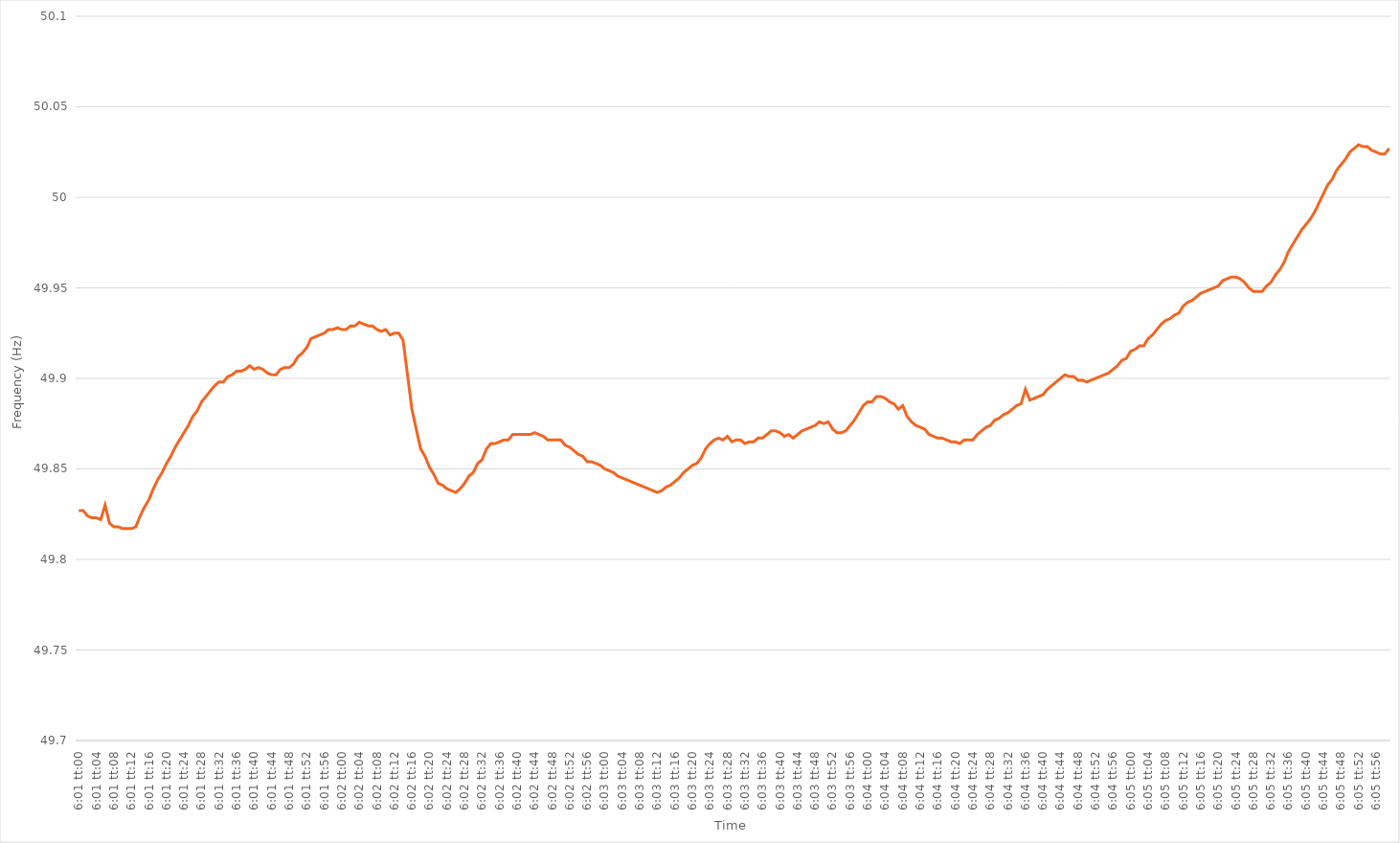
| Category | Series 0 |
|---|---|
| 0.25069444444444444 | 49.827 |
| 0.25070601851851854 | 49.827 |
| 0.2507175925925926 | 49.824 |
| 0.25072916666666667 | 49.823 |
| 0.25074074074074076 | 49.823 |
| 0.2507523148148148 | 49.822 |
| 0.2507638888888889 | 49.83 |
| 0.250775462962963 | 49.82 |
| 0.25078703703703703 | 49.818 |
| 0.2507986111111111 | 49.818 |
| 0.2508101851851852 | 49.817 |
| 0.25082175925925926 | 49.817 |
| 0.2508333333333333 | 49.817 |
| 0.2508449074074074 | 49.818 |
| 0.2508564814814815 | 49.824 |
| 0.2508680555555555 | 49.829 |
| 0.2508796296296296 | 49.833 |
| 0.2508912037037037 | 49.839 |
| 0.25090277777777775 | 49.844 |
| 0.25091435185185185 | 49.848 |
| 0.25092592592592594 | 49.853 |
| 0.2509375 | 49.857 |
| 0.2509490740740741 | 49.862 |
| 0.25096064814814817 | 49.866 |
| 0.2509722222222222 | 49.87 |
| 0.2509837962962963 | 49.874 |
| 0.2509953703703704 | 49.879 |
| 0.25100694444444444 | 49.882 |
| 0.25101851851851853 | 49.887 |
| 0.2510300925925926 | 49.89 |
| 0.25104166666666666 | 49.893 |
| 0.25105324074074076 | 49.896 |
| 0.25106481481481485 | 49.898 |
| 0.2510763888888889 | 49.898 |
| 0.25108796296296293 | 49.901 |
| 0.251099537037037 | 49.902 |
| 0.2511111111111111 | 49.904 |
| 0.25112268518518516 | 49.904 |
| 0.25113425925925925 | 49.905 |
| 0.25114583333333335 | 49.907 |
| 0.2511574074074074 | 49.905 |
| 0.2511689814814815 | 49.906 |
| 0.2511805555555556 | 49.905 |
| 0.2511921296296296 | 49.903 |
| 0.2512037037037037 | 49.902 |
| 0.2512152777777778 | 49.902 |
| 0.25122685185185184 | 49.905 |
| 0.25123842592592593 | 49.906 |
| 0.25125000000000003 | 49.906 |
| 0.25126157407407407 | 49.908 |
| 0.25127314814814816 | 49.912 |
| 0.25128472222222226 | 49.914 |
| 0.2512962962962963 | 49.917 |
| 0.25130787037037033 | 49.922 |
| 0.25131944444444443 | 49.923 |
| 0.2513310185185185 | 49.924 |
| 0.25134259259259256 | 49.925 |
| 0.25135416666666666 | 49.927 |
| 0.25136574074074075 | 49.927 |
| 0.2513773148148148 | 49.928 |
| 0.2513888888888889 | 49.927 |
| 0.251400462962963 | 49.927 |
| 0.251412037037037 | 49.929 |
| 0.2514236111111111 | 49.929 |
| 0.2514351851851852 | 49.931 |
| 0.25144675925925924 | 49.93 |
| 0.25145833333333334 | 49.929 |
| 0.25146990740740743 | 49.929 |
| 0.2514814814814815 | 49.927 |
| 0.25149305555555557 | 49.926 |
| 0.25150462962962966 | 49.927 |
| 0.2515162037037037 | 49.924 |
| 0.2515277777777778 | 49.925 |
| 0.25153935185185183 | 49.925 |
| 0.25155092592592593 | 49.921 |
| 0.25156249999999997 | 49.902 |
| 0.25157407407407406 | 49.883 |
| 0.25158564814814816 | 49.872 |
| 0.2515972222222222 | 49.861 |
| 0.2516087962962963 | 49.857 |
| 0.2516203703703704 | 49.851 |
| 0.2516319444444444 | 49.847 |
| 0.2516435185185185 | 49.842 |
| 0.2516550925925926 | 49.841 |
| 0.25166666666666665 | 49.839 |
| 0.25167824074074074 | 49.838 |
| 0.25168981481481484 | 49.837 |
| 0.2517013888888889 | 49.839 |
| 0.25171296296296297 | 49.842 |
| 0.25172453703703707 | 49.846 |
| 0.2517361111111111 | 49.848 |
| 0.2517476851851852 | 49.853 |
| 0.2517592592592593 | 49.855 |
| 0.25177083333333333 | 49.861 |
| 0.25178240740740737 | 49.864 |
| 0.25179398148148147 | 49.864 |
| 0.25180555555555556 | 49.865 |
| 0.2518171296296296 | 49.866 |
| 0.2518287037037037 | 49.866 |
| 0.2518402777777778 | 49.869 |
| 0.2518518518518518 | 49.869 |
| 0.2518634259259259 | 49.869 |
| 0.251875 | 49.869 |
| 0.25188657407407405 | 49.869 |
| 0.25189814814814815 | 49.87 |
| 0.25190972222222224 | 49.869 |
| 0.2519212962962963 | 49.868 |
| 0.2519328703703704 | 49.866 |
| 0.25194444444444447 | 49.866 |
| 0.2519560185185185 | 49.866 |
| 0.2519675925925926 | 49.866 |
| 0.2519791666666667 | 49.863 |
| 0.25199074074074074 | 49.862 |
| 0.25200231481481483 | 49.86 |
| 0.25201388888888887 | 49.858 |
| 0.25202546296296297 | 49.857 |
| 0.252037037037037 | 49.854 |
| 0.2520486111111111 | 49.854 |
| 0.2520601851851852 | 49.853 |
| 0.25207175925925923 | 49.852 |
| 0.2520833333333333 | 49.85 |
| 0.2520949074074074 | 49.849 |
| 0.25210648148148146 | 49.848 |
| 0.25211805555555555 | 49.846 |
| 0.25212962962962965 | 49.845 |
| 0.2521412037037037 | 49.844 |
| 0.2521527777777778 | 49.843 |
| 0.2521643518518519 | 49.842 |
| 0.2521759259259259 | 49.841 |
| 0.2521875 | 49.84 |
| 0.2521990740740741 | 49.839 |
| 0.25221064814814814 | 49.838 |
| 0.25222222222222224 | 49.837 |
| 0.25223379629629633 | 49.838 |
| 0.25224537037037037 | 49.84 |
| 0.2522569444444444 | 49.841 |
| 0.2522685185185185 | 49.843 |
| 0.2522800925925926 | 49.845 |
| 0.25229166666666664 | 49.848 |
| 0.25230324074074073 | 49.85 |
| 0.2523148148148148 | 49.852 |
| 0.25232638888888886 | 49.853 |
| 0.25233796296296296 | 49.856 |
| 0.25234953703703705 | 49.861 |
| 0.2523611111111111 | 49.864 |
| 0.2523726851851852 | 49.866 |
| 0.2523842592592593 | 49.867 |
| 0.2523958333333333 | 49.866 |
| 0.2524074074074074 | 49.868 |
| 0.2524189814814815 | 49.865 |
| 0.25243055555555555 | 49.866 |
| 0.25244212962962964 | 49.866 |
| 0.25245370370370374 | 49.864 |
| 0.2524652777777778 | 49.865 |
| 0.25247685185185187 | 49.865 |
| 0.2524884259259259 | 49.867 |
| 0.2525 | 49.867 |
| 0.25251157407407404 | 49.869 |
| 0.25252314814814814 | 49.871 |
| 0.25253472222222223 | 49.871 |
| 0.25254629629629627 | 49.87 |
| 0.25255787037037036 | 49.868 |
| 0.25256944444444446 | 49.869 |
| 0.2525810185185185 | 49.867 |
| 0.2525925925925926 | 49.869 |
| 0.2526041666666667 | 49.871 |
| 0.2526157407407407 | 49.872 |
| 0.2526273148148148 | 49.873 |
| 0.2526388888888889 | 49.874 |
| 0.25265046296296295 | 49.876 |
| 0.25266203703703705 | 49.875 |
| 0.25267361111111114 | 49.876 |
| 0.2526851851851852 | 49.872 |
| 0.2526967592592593 | 49.87 |
| 0.25270833333333337 | 49.87 |
| 0.2527199074074074 | 49.871 |
| 0.25273148148148145 | 49.874 |
| 0.25274305555555554 | 49.877 |
| 0.25275462962962963 | 49.881 |
| 0.2527662037037037 | 49.885 |
| 0.25277777777777777 | 49.887 |
| 0.25278935185185186 | 49.887 |
| 0.2528009259259259 | 49.89 |
| 0.2528125 | 49.89 |
| 0.2528240740740741 | 49.889 |
| 0.25283564814814813 | 49.887 |
| 0.2528472222222222 | 49.886 |
| 0.2528587962962963 | 49.883 |
| 0.25287037037037036 | 49.885 |
| 0.25288194444444445 | 49.879 |
| 0.25289351851851855 | 49.876 |
| 0.2529050925925926 | 49.874 |
| 0.2529166666666667 | 49.873 |
| 0.2529282407407408 | 49.872 |
| 0.2529398148148148 | 49.869 |
| 0.2529513888888889 | 49.868 |
| 0.25296296296296295 | 49.867 |
| 0.25297453703703704 | 49.867 |
| 0.2529861111111111 | 49.866 |
| 0.2529976851851852 | 49.865 |
| 0.25300925925925927 | 49.865 |
| 0.2530208333333333 | 49.864 |
| 0.2530324074074074 | 49.866 |
| 0.2530439814814815 | 49.866 |
| 0.25305555555555553 | 49.866 |
| 0.25306712962962963 | 49.869 |
| 0.2530787037037037 | 49.871 |
| 0.25309027777777776 | 49.873 |
| 0.25310185185185186 | 49.874 |
| 0.25311342592592595 | 49.877 |
| 0.253125 | 49.878 |
| 0.2531365740740741 | 49.88 |
| 0.2531481481481482 | 49.881 |
| 0.2531597222222222 | 49.883 |
| 0.2531712962962963 | 49.885 |
| 0.2531828703703704 | 49.886 |
| 0.25319444444444444 | 49.894 |
| 0.2532060185185185 | 49.888 |
| 0.2532175925925926 | 49.889 |
| 0.25322916666666667 | 49.89 |
| 0.2532407407407407 | 49.891 |
| 0.2532523148148148 | 49.894 |
| 0.2532638888888889 | 49.896 |
| 0.25327546296296294 | 49.898 |
| 0.25328703703703703 | 49.9 |
| 0.2532986111111111 | 49.902 |
| 0.25331018518518517 | 49.901 |
| 0.25332175925925926 | 49.901 |
| 0.25333333333333335 | 49.899 |
| 0.2533449074074074 | 49.899 |
| 0.2533564814814815 | 49.898 |
| 0.2533680555555556 | 49.899 |
| 0.2533796296296296 | 49.9 |
| 0.2533912037037037 | 49.901 |
| 0.2534027777777778 | 49.902 |
| 0.25341435185185185 | 49.903 |
| 0.25342592592592594 | 49.905 |
| 0.2534375 | 49.907 |
| 0.2534490740740741 | 49.91 |
| 0.2534606481481481 | 49.911 |
| 0.2534722222222222 | 49.915 |
| 0.2534837962962963 | 49.916 |
| 0.25349537037037034 | 49.918 |
| 0.25350694444444444 | 49.918 |
| 0.25351851851851853 | 49.922 |
| 0.25353009259259257 | 49.924 |
| 0.25354166666666667 | 49.927 |
| 0.25355324074074076 | 49.93 |
| 0.2535648148148148 | 49.932 |
| 0.2535763888888889 | 49.933 |
| 0.253587962962963 | 49.935 |
| 0.253599537037037 | 49.936 |
| 0.2536111111111111 | 49.94 |
| 0.2536226851851852 | 49.942 |
| 0.25363425925925925 | 49.943 |
| 0.25364583333333335 | 49.945 |
| 0.25365740740740744 | 49.947 |
| 0.2536689814814815 | 49.948 |
| 0.2536805555555555 | 49.949 |
| 0.2536921296296296 | 49.95 |
| 0.2537037037037037 | 49.951 |
| 0.25371527777777775 | 49.954 |
| 0.25372685185185184 | 49.955 |
| 0.25373842592592594 | 49.956 |
| 0.25375 | 49.956 |
| 0.25376157407407407 | 49.955 |
| 0.25377314814814816 | 49.953 |
| 0.2537847222222222 | 49.95 |
| 0.2537962962962963 | 49.948 |
| 0.2538078703703704 | 49.948 |
| 0.25381944444444443 | 49.948 |
| 0.2538310185185185 | 49.951 |
| 0.2538425925925926 | 49.953 |
| 0.25385416666666666 | 49.957 |
| 0.25386574074074075 | 49.96 |
| 0.25387731481481485 | 49.964 |
| 0.2538888888888889 | 49.97 |
| 0.253900462962963 | 49.974 |
| 0.253912037037037 | 49.978 |
| 0.2539236111111111 | 49.982 |
| 0.25393518518518515 | 49.985 |
| 0.25394675925925925 | 49.988 |
| 0.25395833333333334 | 49.992 |
| 0.2539699074074074 | 49.997 |
| 0.2539814814814815 | 50.002 |
| 0.25399305555555557 | 50.007 |
| 0.2540046296296296 | 50.01 |
| 0.2540162037037037 | 50.015 |
| 0.2540277777777778 | 50.018 |
| 0.25403935185185184 | 50.021 |
| 0.25405092592592593 | 50.025 |
| 0.2540625 | 50.027 |
| 0.25407407407407406 | 50.029 |
| 0.25408564814814816 | 50.028 |
| 0.25409722222222225 | 50.028 |
| 0.2541087962962963 | 50.026 |
| 0.2541203703703704 | 50.025 |
| 0.2541319444444445 | 50.024 |
| 0.2541435185185185 | 50.024 |
| 0.25415509259259256 | 50.027 |